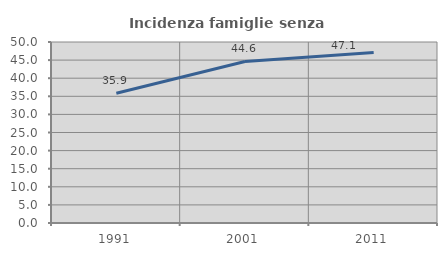
| Category | Incidenza famiglie senza nuclei |
|---|---|
| 1991.0 | 35.859 |
| 2001.0 | 44.615 |
| 2011.0 | 47.09 |